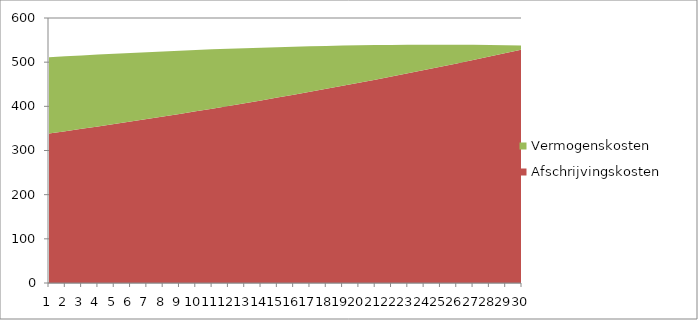
| Category | Afschrijvingskosten | Vermogenskosten |
|---|---|---|
| 0 | 338.5 | 172.635 |
| 1 | 343.747 | 169.467 |
| 2 | 349.075 | 166.16 |
| 3 | 354.485 | 162.709 |
| 4 | 359.98 | 159.111 |
| 5 | 365.56 | 155.363 |
| 6 | 371.226 | 151.46 |
| 7 | 376.98 | 147.399 |
| 8 | 382.823 | 143.176 |
| 9 | 388.757 | 138.786 |
| 10 | 394.783 | 134.226 |
| 11 | 400.902 | 129.491 |
| 12 | 407.116 | 124.577 |
| 13 | 413.426 | 119.48 |
| 14 | 419.834 | 114.195 |
| 15 | 426.341 | 108.717 |
| 16 | 432.95 | 103.042 |
| 17 | 439.66 | 97.165 |
| 18 | 446.475 | 91.081 |
| 19 | 453.396 | 84.785 |
| 20 | 460.423 | 78.272 |
| 21 | 467.56 | 71.537 |
| 22 | 474.807 | 64.574 |
| 23 | 482.166 | 57.378 |
| 24 | 489.64 | 49.943 |
| 25 | 497.229 | 42.265 |
| 26 | 504.937 | 34.336 |
| 27 | 512.763 | 26.151 |
| 28 | 520.711 | 17.704 |
| 29 | 528.782 | 8.989 |